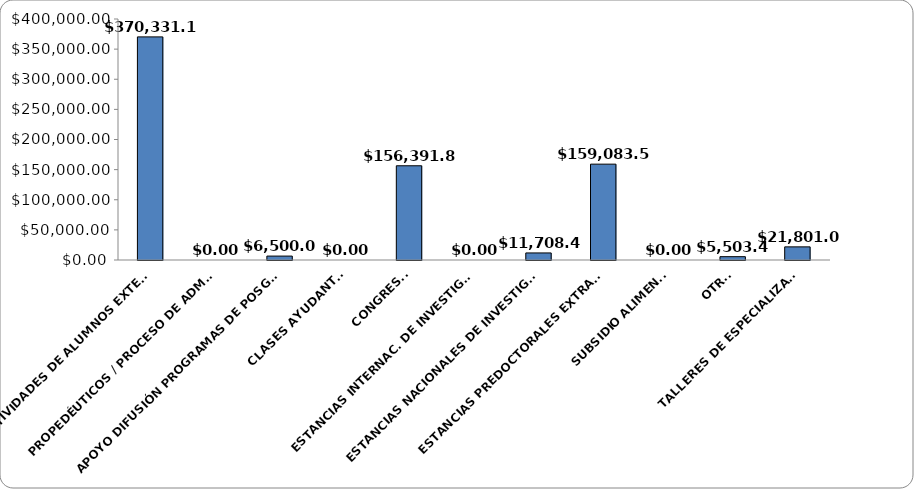
| Category | Series 0 |
|---|---|
| ACTIVIDADES DE ALUMNOS EXTERNOS | 370331.14 |
| PROPEDÉUTICOS / PROCESO DE ADMISIÓN | 0 |
| APOYO DIFUSIÓN PROGRAMAS DE POSGRADO | 6500 |
| CLASES AYUDANTÍAS | 0 |
| CONGRESOS | 156391.88 |
| ESTANCIAS INTERNAC. DE INVESTIGACIÓN | 0 |
| ESTANCIAS NACIONALES DE INVESTIGACIÓN | 11708.4 |
| ESTANCIAS PREDOCTORALES EXTRANJERO | 159083.54 |
| SUBSIDIO ALIMENTOS | 0 |
| OTROS | 5503.4 |
| TALLERES DE ESPECIALIZACIÓN | 21801 |